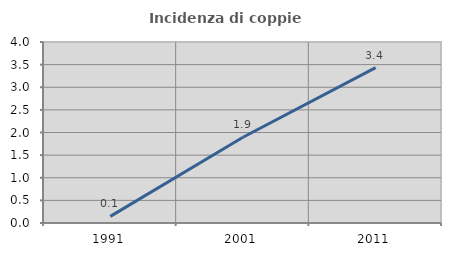
| Category | Incidenza di coppie miste |
|---|---|
| 1991.0 | 0.146 |
| 2001.0 | 1.895 |
| 2011.0 | 3.433 |